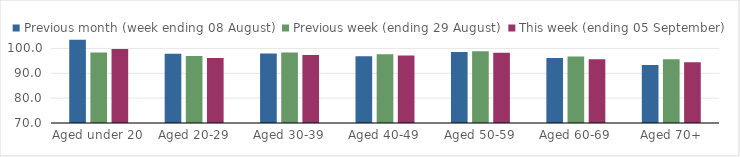
| Category | Previous month (week ending 08 August) | Previous week (ending 29 August) | This week (ending 05 September) |
|---|---|---|---|
| Aged under 20 | 103.48 | 98.36 | 99.79 |
| Aged 20-29 | 97.88 | 97 | 96.1 |
| Aged 30-39 | 97.91 | 98.41 | 97.31 |
| Aged 40-49 | 96.88 | 97.61 | 97.13 |
| Aged 50-59 | 98.58 | 98.88 | 98.27 |
| Aged 60-69 | 96.13 | 96.78 | 95.66 |
| Aged 70+ | 93.33 | 95.61 | 94.46 |